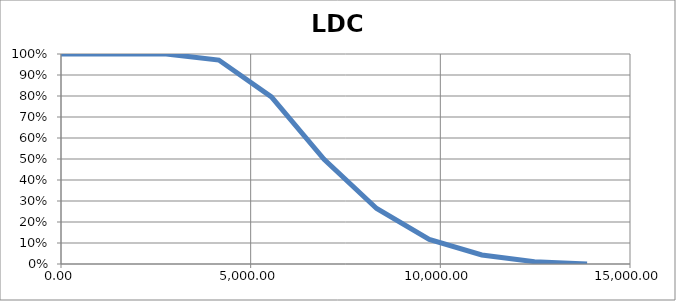
| Category | LDC |
|---|---|
| 0.0 | 1 |
| 1386.830189918269 | 1 |
| 2773.660379836537 | 1 |
| 4160.490569754805 | 0.971 |
| 5547.320759673074 | 0.795 |
| 6934.150949591342 | 0.499 |
| 8320.981139509611 | 0.264 |
| 9707.81132942788 | 0.117 |
| 11094.64151934615 | 0.043 |
| 12481.47170926442 | 0.011 |
| 13868.30189918268 | 0 |